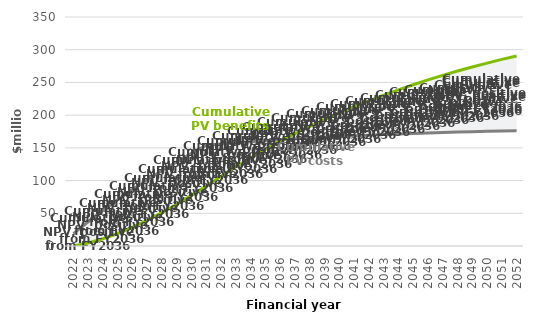
| Category | Cumulative PV costs | Cumulative PV benefits |
|---|---|---|
| 2022.0 | 18.98 | 0 |
| 2023.0 | 37.072 | 4.67 |
| 2024.0 | 54.313 | 11.099 |
| 2025.0 | 70.735 | 19.107 |
| 2026.0 | 86.373 | 28.529 |
| 2027.0 | 101.258 | 39.208 |
| 2028.0 | 115.423 | 50.997 |
| 2029.0 | 128.897 | 63.76 |
| 2030.0 | 141.71 | 77.37 |
| 2031.0 | 153.892 | 91.711 |
| 2032.0 | 155.822 | 106.704 |
| 2033.0 | 157.625 | 120.983 |
| 2034.0 | 159.311 | 134.577 |
| 2035.0 | 160.886 | 147.515 |
| 2036.0 | 162.358 | 159.824 |
| 2037.0 | 163.734 | 171.531 |
| 2038.0 | 165.02 | 182.664 |
| 2039.0 | 166.221 | 193.246 |
| 2040.0 | 167.344 | 203.302 |
| 2041.0 | 168.394 | 212.856 |
| 2042.0 | 169.375 | 221.926 |
| 2043.0 | 170.292 | 230.535 |
| 2044.0 | 171.149 | 238.703 |
| 2045.0 | 171.949 | 246.451 |
| 2046.0 | 172.698 | 253.8 |
| 2047.0 | 173.397 | 260.769 |
| 2048.0 | 174.051 | 267.375 |
| 2049.0 | 174.662 | 273.637 |
| 2050.0 | 175.232 | 279.571 |
| 2051.0 | 175.766 | 285.194 |
| 2052.0 | 176.265 | 290.452 |